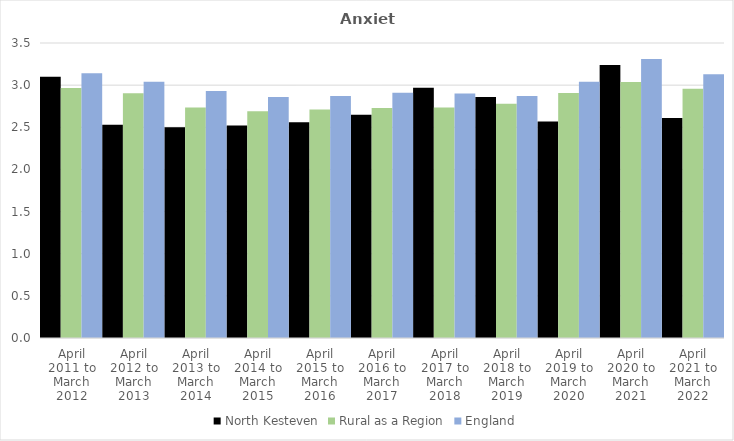
| Category | North Kesteven | Rural as a Region | England |
|---|---|---|---|
| April 2011 to March 2012 | 3.1 | 2.967 | 3.14 |
| April 2012 to March 2013 | 2.53 | 2.904 | 3.04 |
| April 2013 to March 2014 | 2.5 | 2.734 | 2.93 |
| April 2014 to March 2015 | 2.52 | 2.691 | 2.86 |
| April 2015 to March 2016 | 2.56 | 2.711 | 2.87 |
| April 2016 to March 2017 | 2.65 | 2.729 | 2.91 |
| April 2017 to March 2018 | 2.97 | 2.736 | 2.9 |
| April 2018 to March 2019 | 2.86 | 2.78 | 2.87 |
| April 2019 to March 2020 | 2.57 | 2.908 | 3.04 |
| April 2020 to March 2021 | 3.24 | 3.036 | 3.31 |
| April 2021 to March 2022 | 2.61 | 2.956 | 3.13 |